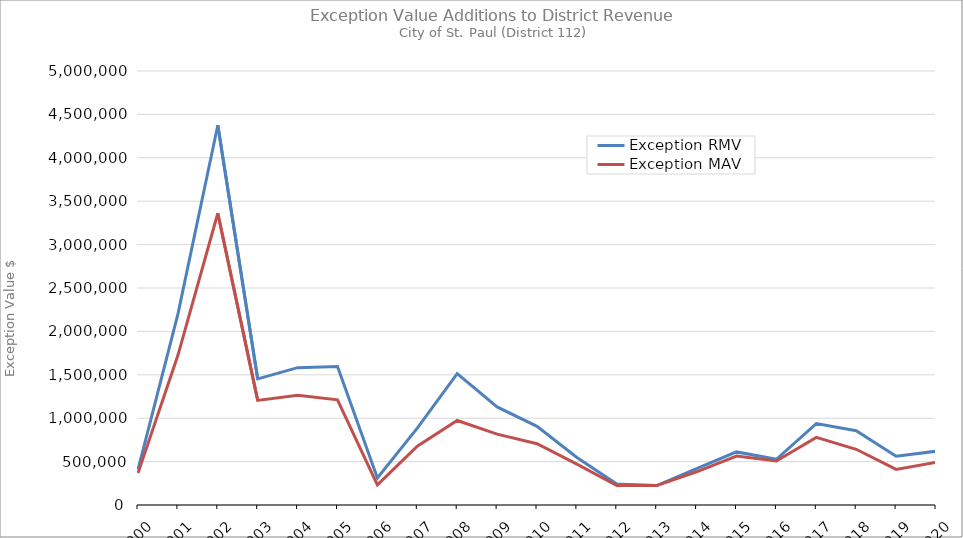
| Category | Exception RMV | Exception MAV |
|---|---|---|
| 2000.0 | 408559 | 367059 |
| 2001.0 | 2199439 | 1724297 |
| 2002.0 | 4374282 | 3361274 |
| 2003.0 | 1452069 | 1205149 |
| 2004.0 | 1582298 | 1264518 |
| 2005.0 | 1595572 | 1211502 |
| 2006.0 | 311416 | 231896 |
| 2007.0 | 885806 | 677754 |
| 2008.0 | 1514233 | 973363 |
| 2009.0 | 1130410 | 816206 |
| 2010.0 | 906166 | 705866 |
| 2011.0 | 547424 | 470824 |
| 2012.0 | 242168 | 223768 |
| 2013.0 | 223399 | 223399 |
| 2014.0 | 418295 | 382635 |
| 2015.0 | 611403 | 563573 |
| 2016.0 | 527137 | 506257 |
| 2017.0 | 938779 | 779539 |
| 2018.0 | 855057 | 642007 |
| 2019.0 | 561577 | 409577 |
| 2020.0 | 619113 | 490923 |